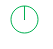
| Category | Series 0 |
|---|---|
| 0 | 0 |
| 1 | 100 |